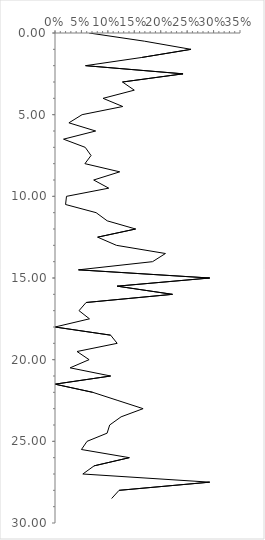
| Category | Series 0 |
|---|---|
| 0.06451612903225806 | 0 |
| 0.16901408450704225 | 0.5 |
| 0.25735294117647056 | 1 |
| 0.16363636363636364 | 1.5 |
| 0.057803468208092484 | 2 |
| 0.2422360248447205 | 2.5 |
| 0.1276595744680851 | 3 |
| 0.15 | 3.5 |
| 0.09090909090909091 | 4 |
| 0.1282051282051282 | 4.5 |
| 0.05128205128205128 | 5 |
| 0.02631578947368421 | 5.5 |
| 0.07692307692307693 | 6 |
| 0.016129032258064516 | 6.5 |
| 0.05714285714285714 | 7 |
| 0.06818181818181818 | 7.5 |
| 0.05660377358490566 | 8 |
| 0.12244897959183673 | 8.5 |
| 0.07317073170731707 | 9 |
| 0.1016949152542373 | 9.5 |
| 0.021739130434782608 | 10 |
| 0.02 | 10.5 |
| 0.07777777777777778 | 11 |
| 0.09876543209876543 | 11.5 |
| 0.15254237288135594 | 12 |
| 0.08064516129032258 | 12.5 |
| 0.11627906976744186 | 13 |
| 0.208955223880597 | 13.5 |
| 0.18461538461538463 | 14 |
| 0.044444444444444446 | 14.5 |
| 0.2926829268292683 | 15 |
| 0.11764705882352941 | 15.5 |
| 0.2222222222222222 | 16 |
| 0.058823529411764705 | 16.5 |
| 0.045454545454545456 | 17 |
| 0.06521739130434782 | 17.5 |
| 0.0 | 18 |
| 0.10526315789473684 | 18.5 |
| 0.11764705882352941 | 19 |
| 0.041666666666666664 | 19.5 |
| 0.06451612903225806 | 20 |
| 0.02857142857142857 | 20.5 |
| 0.10526315789473684 | 21 |
| 0.0 | 21.5 |
| 0.07142857142857142 | 22 |
| 0.11904761904761904 | 22.5 |
| 0.16666666666666666 | 23 |
| 0.125 | 23.5 |
| 0.10344827586206896 | 24 |
| 0.09859154929577464 | 24.5 |
| 0.06060606060606061 | 25 |
| 0.05 | 25.5 |
| 0.140625 | 26 |
| 0.07407407407407407 | 26.5 |
| 0.05263157894736842 | 27 |
| 0.2926829268292683 | 27.5 |
| 0.12121212121212122 | 28 |
| 0.10714285714285714 | 28.5 |